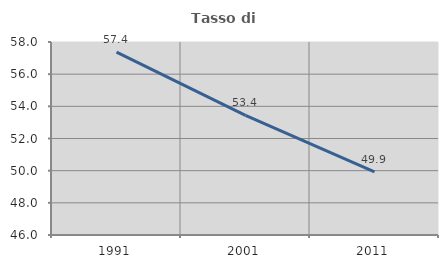
| Category | Tasso di occupazione   |
|---|---|
| 1991.0 | 57.371 |
| 2001.0 | 53.433 |
| 2011.0 | 49.93 |